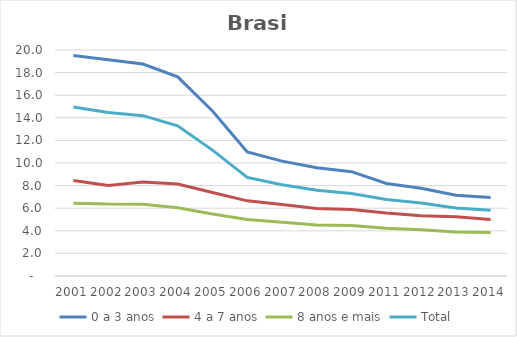
| Category | 0 a 3 anos | 4 a 7 anos | 8 anos e mais | Total |
|---|---|---|---|---|
| 2001.0 | 19.523 | 8.45 | 6.442 | 14.955 |
| 2002.0 | 19.13 | 8.001 | 6.362 | 14.475 |
| 2003.0 | 18.754 | 8.309 | 6.351 | 14.19 |
| 2004.0 | 17.62 | 8.148 | 6.034 | 13.285 |
| 2005.0 | 14.608 | 7.384 | 5.493 | 11.14 |
| 2006.0 | 10.983 | 6.652 | 5.004 | 8.721 |
| 2007.0 | 10.165 | 6.325 | 4.751 | 8.08 |
| 2008.0 | 9.589 | 5.984 | 4.514 | 7.593 |
| 2009.0 | 9.234 | 5.879 | 4.474 | 7.309 |
| 2011.0 | 8.185 | 5.569 | 4.236 | 6.776 |
| 2012.0 | 7.765 | 5.336 | 4.092 | 6.452 |
| 2013.0 | 7.138 | 5.236 | 3.897 | 6.009 |
| 2014.0 | 6.955 | 5.008 | 3.848 | 5.816 |